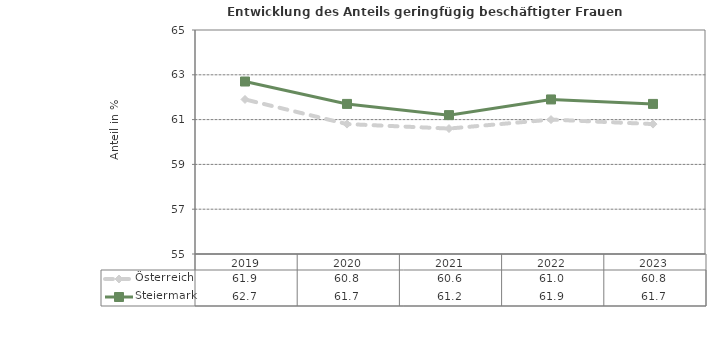
| Category | Österreich | Steiermark |
|---|---|---|
| 2023.0 | 60.8 | 61.7 |
| 2022.0 | 61 | 61.9 |
| 2021.0 | 60.6 | 61.2 |
| 2020.0 | 60.8 | 61.7 |
| 2019.0 | 61.9 | 62.7 |